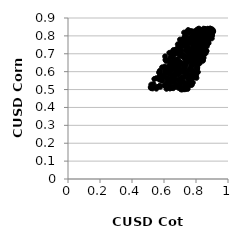
| Category | Series 0 |
|---|---|
| 0.8032709693896705 | 0.79 |
| 0.7423548564855764 | 0.739 |
| 0.6598434259487107 | 0.515 |
| 0.8691043415368068 | 0.803 |
| 0.8714225391466073 | 0.755 |
| 0.7827376489282902 | 0.652 |
| 0.6778970178173784 | 0.717 |
| 0.765579957225321 | 0.791 |
| 0.8115892868456154 | 0.598 |
| 0.796213893338463 | 0.692 |
| 0.7727589334761511 | 0.672 |
| 0.6329274914132588 | 0.634 |
| 0.8553405302881449 | 0.713 |
| 0.5689961544769234 | 0.595 |
| 0.7640300589531128 | 0.784 |
| 0.6557807507965396 | 0.583 |
| 0.6091190718727961 | 0.667 |
| 0.6632267273853174 | 0.541 |
| 0.8471008135141167 | 0.782 |
| 0.7099137604627728 | 0.597 |
| 0.5938261171411459 | 0.569 |
| 0.8681933570394909 | 0.809 |
| 0.64987128310343 | 0.683 |
| 0.5747970729806625 | 0.576 |
| 0.8402530996299308 | 0.751 |
| 0.5775720611950468 | 0.516 |
| 0.6837698497112241 | 0.626 |
| 0.6935339429260345 | 0.649 |
| 0.7906924804094604 | 0.65 |
| 0.7119114350522229 | 0.644 |
| 0.8137696616904289 | 0.834 |
| 0.7173182907097406 | 0.741 |
| 0.6727061191246002 | 0.622 |
| 0.8824640731678026 | 0.796 |
| 0.6939071413159161 | 0.754 |
| 0.6333331862572439 | 0.659 |
| 0.880119370819711 | 0.808 |
| 0.8771130128697302 | 0.8 |
| 0.6607062792613847 | 0.579 |
| 0.7282156086045215 | 0.79 |
| 0.8045231410309145 | 0.617 |
| 0.6472357720883822 | 0.697 |
| 0.8404713862704031 | 0.811 |
| 0.5397078846793173 | 0.559 |
| 0.7272654293517986 | 0.673 |
| 0.6522062979172762 | 0.636 |
| 0.8665192584665528 | 0.802 |
| 0.806164045816672 | 0.702 |
| 0.7362107198786281 | 0.683 |
| 0.7638232828013003 | 0.826 |
| 0.8195793910856913 | 0.727 |
| 0.6913165221718701 | 0.584 |
| 0.6327685582147213 | 0.548 |
| 0.6282035819923698 | 0.591 |
| 0.519693292914761 | 0.508 |
| 0.7469606546344709 | 0.521 |
| 0.7575331703740695 | 0.559 |
| 0.8288218761124342 | 0.727 |
| 0.8795981114739099 | 0.825 |
| 0.7050349001096436 | 0.641 |
| 0.8088200741405508 | 0.74 |
| 0.8286301080964353 | 0.82 |
| 0.6685274058431881 | 0.575 |
| 0.8227854008310271 | 0.647 |
| 0.7733393202095609 | 0.526 |
| 0.8072804352926395 | 0.688 |
| 0.861658471779306 | 0.778 |
| 0.8387816660067539 | 0.772 |
| 0.8759151413777412 | 0.786 |
| 0.7753280677120488 | 0.658 |
| 0.7538196244558724 | 0.761 |
| 0.7237128470297125 | 0.623 |
| 0.7755830877020009 | 0.773 |
| 0.8263482534901276 | 0.759 |
| 0.7725611516733412 | 0.645 |
| 0.6044058127038338 | 0.629 |
| 0.7388403730750214 | 0.748 |
| 0.7323420790990469 | 0.796 |
| 0.5721867065260565 | 0.52 |
| 0.5793302320056788 | 0.566 |
| 0.6459773080879805 | 0.509 |
| 0.8770519983634966 | 0.788 |
| 0.6194709167579291 | 0.567 |
| 0.6619589148823541 | 0.561 |
| 0.7542343827593938 | 0.572 |
| 0.7093017567323795 | 0.568 |
| 0.804156059186065 | 0.832 |
| 0.6474460923805192 | 0.577 |
| 0.6404696853076176 | 0.625 |
| 0.866151810777639 | 0.715 |
| 0.7257766805225991 | 0.502 |
| 0.7431477108776974 | 0.771 |
| 0.8363078032742416 | 0.757 |
| 0.8943332809760327 | 0.835 |
| 0.749058573822742 | 0.586 |
| 0.8089252955472758 | 0.822 |
| 0.7934841771219743 | 0.642 |
| 0.7695768371874804 | 0.724 |
| 0.7547589923511685 | 0.679 |
| 0.7421306874875271 | 0.733 |
| 0.75348026258225 | 0.523 |
| 0.7846083117250888 | 0.676 |
| 0.7125061593227802 | 0.543 |
| 0.7283871585288235 | 0.758 |
| 0.7994548251470469 | 0.714 |
| 0.6757330283038707 | 0.63 |
| 0.8801202028509731 | 0.79 |
| 0.6767604495825813 | 0.725 |
| 0.6838551736538475 | 0.636 |
| 0.6202162658376055 | 0.556 |
| 0.7583969121939733 | 0.677 |
| 0.7106939502998884 | 0.763 |
| 0.8534857246416968 | 0.836 |
| 0.8514262892064758 | 0.719 |
| 0.8166134649791368 | 0.783 |
| 0.7663943331490303 | 0.574 |
| 0.7312433982489948 | 0.522 |
| 0.8388205085107627 | 0.744 |
| 0.573473413349401 | 0.569 |
| 0.605248125059233 | 0.523 |
| 0.6364177093774204 | 0.606 |
| 0.8978253815106574 | 0.826 |
| 0.6845414932845755 | 0.555 |
| 0.7025712322271571 | 0.697 |
| 0.8638566810133051 | 0.757 |
| 0.7391472050033255 | 0.799 |
| 0.803992619431873 | 0.72 |
| 0.8860656333993523 | 0.827 |
| 0.6692000110771155 | 0.643 |
| 0.7137696789688032 | 0.639 |
| 0.7190120735686015 | 0.763 |
| 0.7806549943993195 | 0.734 |
| 0.6918135688422788 | 0.553 |
| 0.8664537927338196 | 0.828 |
| 0.6654469035957716 | 0.709 |
| 0.8402578489220114 | 0.82 |
| 0.7384934539696669 | 0.64 |
| 0.7512672709647772 | 0.703 |
| 0.7115889098477752 | 0.747 |
| 0.7203584612348345 | 0.758 |
| 0.7064198570597944 | 0.751 |
| 0.8105989640618897 | 0.637 |
| 0.7340453391882493 | 0.717 |
| 0.7295389295658214 | 0.794 |
| 0.6672661514933329 | 0.715 |
| 0.7688472253540917 | 0.615 |
| 0.8081610767742068 | 0.736 |
| 0.6622719589834678 | 0.613 |
| 0.6739571058094502 | 0.53 |
| 0.7318077837816779 | 0.628 |
| 0.7711310566042715 | 0.61 |
| 0.7276701120755408 | 0.571 |
| 0.7099986784619694 | 0.513 |
| 0.707141092402807 | 0.718 |
| 0.6536394769817286 | 0.645 |
| 0.8476036473724986 | 0.678 |
| 0.7289987892245122 | 0.789 |
| 0.7058838440510679 | 0.501 |
| 0.7436741864147498 | 0.766 |
| 0.8607209331284937 | 0.8 |
| 0.6154642180490486 | 0.504 |
| 0.8759411780651589 | 0.776 |
| 0.7055508929999025 | 0.698 |
| 0.8034355838342349 | 0.777 |
| 0.6479561899821824 | 0.582 |
| 0.742640021879776 | 0.529 |
| 0.779450347132422 | 0.662 |
| 0.8105051209622801 | 0.837 |
| 0.6301106878358884 | 0.55 |
| 0.8179566553021137 | 0.84 |
| 0.8313522321203889 | 0.83 |
| 0.8056391126235697 | 0.728 |
| 0.6332785449012553 | 0.705 |
| 0.5775161577887029 | 0.588 |
| 0.7795075506249245 | 0.815 |
| 0.7867610947239991 | 0.785 |
| 0.7098566358340308 | 0.54 |
| 0.8430538366364626 | 0.661 |
| 0.7536178042764098 | 0.723 |
| 0.7368473742050092 | 0.662 |
| 0.7305381670419013 | 0.78 |
| 0.82718887848626 | 0.671 |
| 0.6896869551601871 | 0.51 |
| 0.8752482424398266 | 0.769 |
| 0.8593856007419368 | 0.762 |
| 0.7265373918178524 | 0.638 |
| 0.7036787851549049 | 0.551 |
| 0.6565587777293431 | 0.627 |
| 0.8383410415097502 | 0.767 |
| 0.7972829842199722 | 0.73 |
| 0.5737951716121463 | 0.605 |
| 0.7542074944802746 | 0.57 |
| 0.7882678889008401 | 0.572 |
| 0.5173630703787712 | 0.513 |
| 0.774537172742852 | 0.581 |
| 0.8006778995175717 | 0.638 |
| 0.6928064798666982 | 0.619 |
| 0.8741063806953786 | 0.783 |
| 0.870817246412191 | 0.799 |
| 0.89450302686768 | 0.813 |
| 0.7392505908710123 | 0.765 |
| 0.6038164441284374 | 0.607 |
| 0.8362119118429244 | 0.75 |
| 0.7263367499885969 | 0.612 |
| 0.5314006532622519 | 0.517 |
| 0.6418031825860185 | 0.542 |
| 0.8075193728055542 | 0.624 |
| 0.7225342429461605 | 0.542 |
| 0.8553838301177639 | 0.726 |
| 0.781192668793234 | 0.712 |
| 0.6575897805093425 | 0.508 |
| 0.8119907067193153 | 0.768 |
| 0.7762066515214093 | 0.65 |
| 0.7256245793398888 | 0.599 |
| 0.7863880553086041 | 0.696 |
| 0.7909509361918339 | 0.825 |
| 0.6464478923391506 | 0.51 |
| 0.8272743025204821 | 0.732 |
| 0.6969344807598599 | 0.627 |
| 0.6166084746153143 | 0.593 |
| 0.6248821329984071 | 0.535 |
| 0.7736759634122263 | 0.629 |
| 0.6998454899499638 | 0.704 |
| 0.6979841043138573 | 0.653 |
| 0.8257973348162633 | 0.794 |
| 0.8949694678438953 | 0.812 |
| 0.6564048668223479 | 0.71 |
| 0.8135377942328204 | 0.693 |
| 0.8117417465970665 | 0.792 |
| 0.6571484864448363 | 0.689 |
| 0.8320771025849988 | 0.7 |
| 0.533887647944649 | 0.531 |
| 0.7907410657887838 | 0.588 |
| 0.8358017524959228 | 0.746 |
| 0.7794568502730198 | 0.688 |
| 0.7850541750455688 | 0.602 |
| 0.6418635814719591 | 0.561 |
| 0.5862020279319375 | 0.549 |
| 0.8391482701783927 | 0.831 |
| 0.8853080494634721 | 0.789 |
| 0.6724222661877335 | 0.59 |
| 0.763548444712587 | 0.768 |
| 0.7432097333449563 | 0.521 |
| 0.8051088386212268 | 0.594 |
| 0.6684249609323338 | 0.577 |
| 0.6256055548359836 | 0.544 |
| 0.780225585589942 | 0.539 |
| 0.6527471378187855 | 0.657 |
| 0.5522353841979484 | 0.505 |
| 0.7348350775101252 | 0.502 |
| 0.8674172011176938 | 0.742 |
| 0.6541757701839088 | 0.691 |
| 0.758494909651827 | 0.534 |
| 0.8043880667972751 | 0.62 |
| 0.8350919824585963 | 0.829 |
| 0.6941183682122629 | 0.737 |
| 0.7677942567391318 | 0.538 |
| 0.858767403330034 | 0.801 |
| 0.7899956717226198 | 0.811 |
| 0.7601010153337655 | 0.729 |
| 0.8229708177284629 | 0.836 |
| 0.9026632037954024 | 0.817 |
| 0.800653049115692 | 0.58 |
| 0.6743735953518992 | 0.632 |
| 0.7509926994845911 | 0.537 |
| 0.8041687026402066 | 0.669 |
| 0.7526626436029425 | 0.657 |
| 0.6590966436143617 | 0.721 |
| 0.7536124999165146 | 0.714 |
| 0.8482703252560583 | 0.77 |
| 0.7939350076979133 | 0.716 |
| 0.8065258767415783 | 0.617 |
| 0.7645281001276926 | 0.526 |
| 0.8298544823551988 | 0.781 |
| 0.900179090952779 | 0.803 |
| 0.7624680642739496 | 0.614 |
| 0.7569164949892593 | 0.71 |
| 0.8383278038372611 | 0.808 |
| 0.8927649718064053 | 0.793 |
| 0.8161274867208911 | 0.832 |
| 0.5898379512850087 | 0.553 |
| 0.7480391428663757 | 0.564 |
| 0.8422877342297211 | 0.741 |
| 0.8023822088120829 | 0.814 |
| 0.779887884954922 | 0.597 |
| 0.7246171414025189 | 0.691 |
| 0.6929604707624023 | 0.699 |
| 0.8090423591071062 | 0.678 |
| 0.6901081000426497 | 0.589 |
| 0.764297434544697 | 0.545 |
| 0.6389143337643344 | 0.518 |
| 0.5707921079398497 | 0.556 |
| 0.8734069489953272 | 0.795 |
| 0.7349379624645013 | 0.649 |
| 0.6466728139655606 | 0.707 |
| 0.811206891568404 | 0.672 |
| 0.7925205659479373 | 0.731 |
| 0.520673768344847 | 0.528 |
| 0.8945789761978964 | 0.83 |
| 0.6929046008509305 | 0.531 |
| 0.8070105750034693 | 0.616 |
| 0.8479890022797165 | 0.733 |
| 0.6469837983717996 | 0.681 |
| 0.8120115932521315 | 0.68 |
| 0.5708767215018441 | 0.518 |
| 0.7583929079497014 | 0.821 |
| 0.8571403182245638 | 0.819 |
| 0.8730019235811741 | 0.84 |
| 0.8566818354562867 | 0.817 |
| 0.8747554353596836 | 0.813 |
| 0.7123460083003081 | 0.756 |
| 0.6821340634445299 | 0.706 |
| 0.8062270229683994 | 0.652 |
| 0.7640222525272916 | 0.62 |
| 0.5218087248418877 | 0.512 |
| 0.5553833788162691 | 0.514 |
| 0.7020000690593868 | 0.722 |
| 0.7819106693216886 | 0.798 |
| 0.8470623523992796 | 0.84 |
| 0.7477594051710688 | 0.602 |
| 0.6045092104476655 | 0.524 |
| 0.7938500899156526 | 0.772 |
| 0.8019696741274474 | 0.723 |
| 0.5881167215792954 | 0.624 |
| 0.5847119534395125 | 0.58 |
| 0.8234609345021229 | 0.734 |
| 0.6147055295968982 | 0.535 |
| 0.8305534976725266 | 0.823 |
| 0.7600284535162085 | 0.761 |
| 0.7966381738687425 | 0.752 |
| 0.842016805765151 | 0.704 |
| 0.8963604844928772 | 0.837 |
| 0.7132939887153296 | 0.501 |
| 0.6136442408252278 | 0.66 |
| 0.6620749496418743 | 0.666 |
| 0.7303567890378486 | 0.619 |
| 0.8331524510055195 | 0.721 |
| 0.8782024948499749 | 0.838 |
| 0.8631691311011693 | 0.829 |
| 0.7021958533654091 | 0.687 |
| 0.8212627881632265 | 0.656 |
| 0.6905481701690392 | 0.603 |
| 0.5843848699094814 | 0.578 |
| 0.7984555521060686 | 0.815 |
| 0.7479962037426425 | 0.504 |
| 0.7895717574319614 | 0.807 |
| 0.8148357291184969 | 0.834 |
| 0.7596059266898231 | 0.68 |
| 0.878535743118565 | 0.76 |
| 0.7109751965561077 | 0.55 |
| 0.6131331666363796 | 0.622 |
| 0.711149110588448 | 0.646 |
| 0.7705928870002344 | 0.635 |
| 0.7075783105933062 | 0.608 |
| 0.7381533567015426 | 0.819 |
| 0.7193241067431531 | 0.778 |
| 0.6789615810448852 | 0.611 |
| 0.8488598629719599 | 0.694 |
| 0.6815795668717068 | 0.653 |
| 0.6443146969466802 | 0.606 |
| 0.7357550141190204 | 0.685 |
| 0.898684437132976 | 0.802 |
| 0.8156607896738238 | 0.729 |
| 0.5820125032003665 | 0.562 |
| 0.7789898338406039 | 0.77 |
| 0.8469566487373478 | 0.803 |
| 0.6320408128118286 | 0.611 |
| 0.7983889805592735 | 0.706 |
| 0.7808475260207768 | 0.565 |
| 0.7193998446460548 | 0.749 |
| 0.8329611126447011 | 0.692 |
| 0.9072055657991427 | 0.828 |
| 0.715821832068351 | 0.765 |
| 0.6807829316332223 | 0.643 |
| 0.7509141591388235 | 0.833 |
| 0.6073563672836835 | 0.596 |
| 0.7846266337321905 | 0.676 |
| 0.8985180164195321 | 0.786 |
| 0.788418188167696 | 0.806 |
| 0.7440517346513875 | 0.593 |
| 0.8745595736459906 | 0.78 |
| 0.7451315868311541 | 0.674 |
| 0.6333457851035424 | 0.668 |
| 0.7803465576700006 | 0.804 |
| 0.7266407566161125 | 0.573 |
| 0.8119710548975738 | 0.663 |
| 0.7781462191721147 | 0.822 |
| 0.7144540109199713 | 0.548 |
| 0.8627596986416805 | 0.775 |
| 0.891432073102078 | 0.839 |
| 0.7927588135876735 | 0.809 |
| 0.6671969799135951 | 0.592 |
| 0.6394920716680534 | 0.647 |
| 0.8795487075834098 | 0.777 |
| 0.7776661228548115 | 0.754 |
| 0.725141692567888 | 0.787 |
| 0.7850248939169768 | 0.764 |
| 0.6707863681837736 | 0.517 |
| 0.7042071909252797 | 0.536 |
| 0.7279414735946057 | 0.781 |
| 0.7807093109535631 | 0.775 |
| 0.8601098892734728 | 0.833 |
| 0.696602647457853 | 0.655 |
| 0.9028665268710335 | 0.835 |
| 0.7496861528930099 | 0.686 |
| 0.7124454491547627 | 0.766 |
| 0.7595169073905482 | 0.818 |
| 0.8101728938061662 | 0.754 |
| 0.7412976160061954 | 0.72 |
| 0.829073044866307 | 0.668 |
| 0.6627789700321143 | 0.552 |
| 0.8458955110160212 | 0.744 |
| 0.720998233209811 | 0.604 |
| 0.6973431610624727 | 0.609 |
| 0.7397530542890304 | 0.739 |
| 0.8082859846240666 | 0.824 |
| 0.6767712996713905 | 0.726 |
| 0.7366681329798902 | 0.793 |
| 0.8559858980377876 | 0.821 |
| 0.8422573661944027 | 0.665 |
| 0.8077389096691403 | 0.805 |
| 0.5287263242974136 | 0.507 |
| 0.8137883859945584 | 0.696 |
| 0.7243834140951371 | 0.747 |
| 0.7540998388795984 | 0.547 |
| 0.6419665067834401 | 0.682 |
| 0.6985687262895119 | 0.525 |
| 0.7300869025102039 | 0.774 |
| 0.85641895634088 | 0.76 |
| 0.8276561609494468 | 0.797 |
| 0.7986534627709758 | 0.671 |
| 0.6481959762830867 | 0.631 |
| 0.8183119058352626 | 0.831 |
| 0.6784050946348729 | 0.633 |
| 0.7713439262402546 | 0.827 |
| 0.6695382431777221 | 0.701 |
| 0.8423934151885003 | 0.784 |
| 0.6715606938360887 | 0.666 |
| 0.6832738430206557 | 0.669 |
| 0.7129834048692383 | 0.699 |
| 0.8385460785546646 | 0.798 |
| 0.8560104837313892 | 0.737 |
| 0.7945542566751029 | 0.816 |
| 0.8002679495648325 | 0.69 |
| 0.5724569885126723 | 0.558 |
| 0.77857943197154 | 0.806 |
| 0.8594375863678958 | 0.787 |
| 0.700066575963861 | 0.779 |
| 0.6954331284319875 | 0.633 |
| 0.624938892966353 | 0.532 |
| 0.7037854695383339 | 0.56 |
| 0.7653998547683083 | 0.694 |
| 0.6369128220791889 | 0.506 |
| 0.728683049739114 | 0.749 |
| 0.856505010820873 | 0.839 |
| 0.767332494151442 | 0.584 |
| 0.8154713937343239 | 0.816 |
| 0.7877830027053849 | 0.654 |
| 0.7771230823952247 | 0.664 |
| 0.8148705461186638 | 0.774 |
| 0.8599566270558348 | 0.703 |
| 0.6498553462943686 | 0.54 |
| 0.6168458684349563 | 0.608 |
| 0.6800800374894294 | 0.614 |
| 0.6070810010633103 | 0.685 |
| 0.7557997440843225 | 0.533 |
| 0.8885856552387491 | 0.841 |
| 0.7879666107145615 | 0.735 |
| 0.8107909594203093 | 0.743 |
| 0.6261305264700658 | 0.6 |
| 0.6335042168653562 | 0.586 |
| 0.7256665867089934 | 0.818 |
| 0.7906054455394613 | 0.659 |
| 0.9068686126098089 | 0.823 |
| 0.8068255628960719 | 0.746 |
| 0.806503593529063 | 0.745 |
| 0.6230557752472559 | 0.6 |
| 0.8146920373261196 | 0.709 |
| 0.7206968532603979 | 0.684 |
| 0.8325814338272863 | 0.771 |
| 0.692030561112282 | 0.528 |
| 0.701480780598622 | 0.557 |
| 0.8028665803945804 | 0.565 |
| 0.631035336219397 | 0.546 |
| 0.8277680012301826 | 0.732 |
| 0.8310039539280849 | 0.708 |
| 0.7896743056816145 | 0.811 |
| 0.7473300796512681 | 0.742 |
| 0.6933827467354097 | 0.738 |
| 0.7837306140328136 | 0.711 |
| 0.847223264280552 | 0.806 |
| 0.7531239869040832 | 0.674 |
| 0.8309323706556896 | 0.81 |
| 0.6058872633278418 | 0.585 |
| 0.7342831276152866 | 0.591 |
| 0.8796645780810213 | 0.838 |
| 0.6864470102702624 | 0.753 |
| 0.8876210591051094 | 0.813 |
| 0.889225017852929 | 0.795 |
| 0.5526495629607097 | 0.563 |